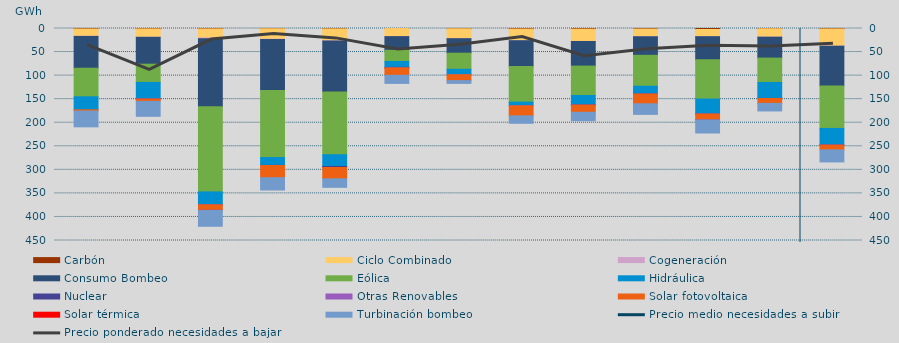
| Category | Carbón | Ciclo Combinado | Cogeneración | Consumo Bombeo | Eólica | Hidráulica | Nuclear | Otras Renovables | Solar fotovoltaica | Solar térmica | Turbinación bombeo |
|---|---|---|---|---|---|---|---|---|---|---|---|
| 0 | 1013 | 15498.975 | 284.05 | 67580.25 | 60658.55 | 27501.4 | 0 | 0 | 2682.825 | 0 | 33526.625 |
| 1 | 883 | 17650.875 | 181.5 | 57086.475 | 38624.325 | 35109.7 | 186 | 16 | 4912.925 | 0 | 31800.3 |
| 2 | 906 | 19278.9 | 1400.95 | 144482.175 | 180813.55 | 26734.575 | 692.75 | 22 | 11477.9 | 11 | 34001.625 |
| 3 | 552 | 22218.15 | 797.8 | 108258.5 | 142089.65 | 16666.15 | 246.5 | 0 | 25852.05 | 0 | 26149.6 |
| 4 | 807.25 | 25335.65 | 347.3 | 108093.3 | 133344.025 | 24879.7 | 2223.5 | 0 | 24040.15 | 0 | 18092.95 |
| 5 | 106 | 17047.925 | 126.5 | 29117.95 | 23568.5 | 12502.85 | 1151.275 | 77.25 | 15574.875 | 0 | 17276.575 |
| 6 | 579.2 | 20963.4 | 137.5 | 30788.55 | 34164.875 | 11525.425 | 0 | 54.75 | 12384.3 | 0 | 5908.5 |
| 7 | 1158 | 24501.45 | 317.675 | 54673.8 | 75655.3 | 7633.3 | 0 | 222.25 | 21301.725 | 0 | 15716.4 |
| 8 | 1320 | 26201.875 | 114.975 | 52169.95 | 62410.575 | 19581.95 | 749.725 | 79.5 | 15213.95 | 0 | 17984.525 |
| 9 | 1091.6 | 16369.1 | 103.875 | 39371.7 | 65624.175 | 15878.2 | 732.15 | 7.75 | 20634.675 | 0 | 22496.1 |
| 10 | 2086.9 | 15113 | 225.75 | 49033.5 | 83287.225 | 31392.5 | 350.375 | 84.5 | 12135.55 | 4 | 28067.275 |
| 11 | 494 | 17543.65 | 436.35 | 44328 | 51868 | 33738.425 | 24 | 178.25 | 10381.85 | 0 | 16037.9 |
| 12 | 948.3 | 36176.575 | 388.925 | 84350 | 90254.85 | 35013.025 | 218 | 283.75 | 10047.9 | 0 | 25499.975 |